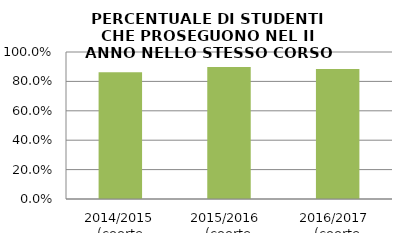
| Category | 2014/2015 (coorte 2013/14) 2015/2016  (coorte 2014/15) 2016/2017  (coorte 2015/16) |
|---|---|
| 2014/2015 (coorte 2013/14) | 0.862 |
| 2015/2016  (coorte 2014/15) | 0.897 |
| 2016/2017  (coorte 2015/16) | 0.885 |